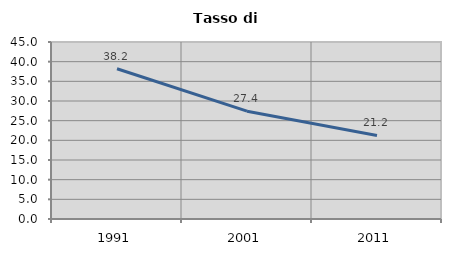
| Category | Tasso di disoccupazione   |
|---|---|
| 1991.0 | 38.2 |
| 2001.0 | 27.415 |
| 2011.0 | 21.233 |